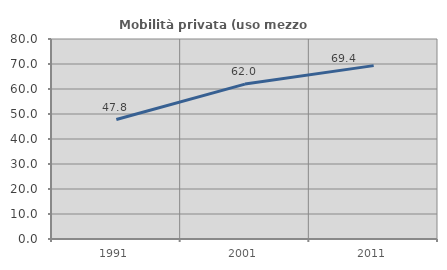
| Category | Mobilità privata (uso mezzo privato) |
|---|---|
| 1991.0 | 47.774 |
| 2001.0 | 61.961 |
| 2011.0 | 69.355 |